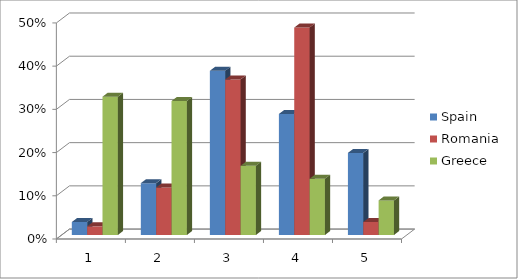
| Category | Spain | Romania | Greece |
|---|---|---|---|
| 0 | 0.03 | 0.02 | 0.32 |
| 1 | 0.12 | 0.11 | 0.31 |
| 2 | 0.38 | 0.36 | 0.16 |
| 3 | 0.28 | 0.48 | 0.13 |
| 4 | 0.19 | 0.03 | 0.08 |